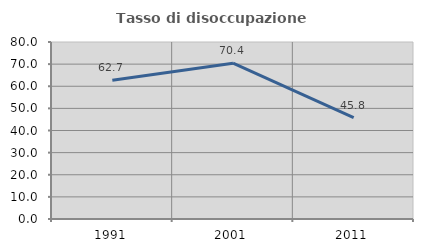
| Category | Tasso di disoccupazione giovanile  |
|---|---|
| 1991.0 | 62.731 |
| 2001.0 | 70.4 |
| 2011.0 | 45.783 |